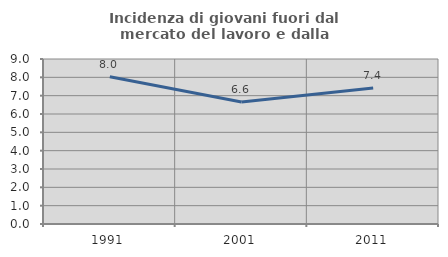
| Category | Incidenza di giovani fuori dal mercato del lavoro e dalla formazione  |
|---|---|
| 1991.0 | 8.037 |
| 2001.0 | 6.65 |
| 2011.0 | 7.424 |